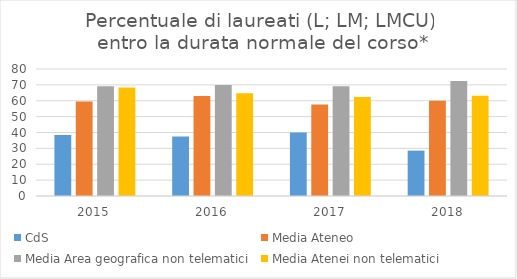
| Category | CdS | Media Ateneo | Media Area geografica non telematici | Media Atenei non telematici |
|---|---|---|---|---|
| 2015.0 | 38.5 | 59.6 | 69.1 | 68.3 |
| 2016.0 | 37.5 | 63 | 69.9 | 64.7 |
| 2017.0 | 40 | 57.6 | 69.1 | 62.4 |
| 2018.0 | 28.6 | 60 | 72.4 | 63.1 |